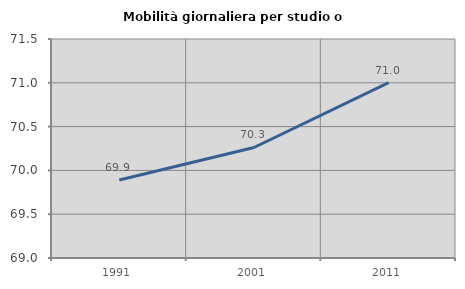
| Category | Mobilità giornaliera per studio o lavoro |
|---|---|
| 1991.0 | 69.891 |
| 2001.0 | 70.261 |
| 2011.0 | 71.001 |